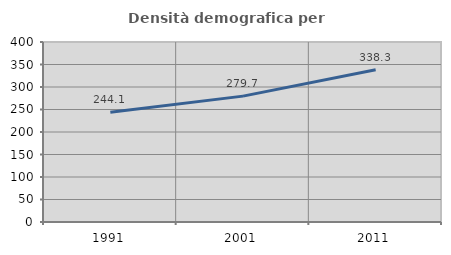
| Category | Densità demografica |
|---|---|
| 1991.0 | 244.103 |
| 2001.0 | 279.702 |
| 2011.0 | 338.314 |